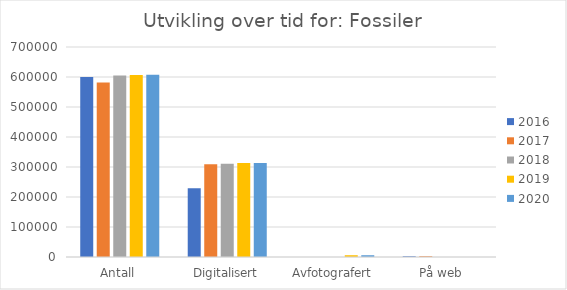
| Category | 2016 | 2017 | 2018 | 2019 | 2020 |
|---|---|---|---|---|---|
| Antall | 600254 | 581779 | 605047 | 606935 | 607135 |
| Digitalisert | 228791 | 308907 | 311069 | 312957 | 313157 |
| Avfotografert | 0 | 0 | 0 | 5900 | 5900 |
| På web | 2519 | 2519 | 0 | 0 | 0 |